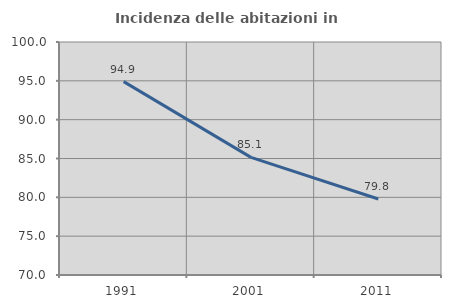
| Category | Incidenza delle abitazioni in proprietà  |
|---|---|
| 1991.0 | 94.898 |
| 2001.0 | 85.149 |
| 2011.0 | 79.787 |